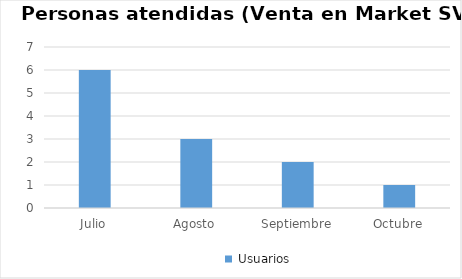
| Category | Series 0 |
|---|---|
| Julio | 6 |
| Agosto | 3 |
| Septiembre | 2 |
| Octubre | 1 |